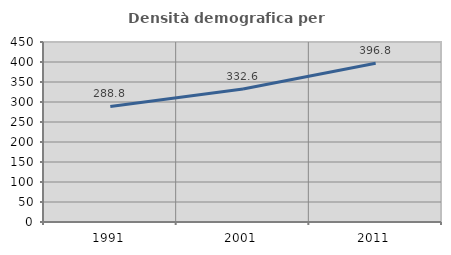
| Category | Densità demografica |
|---|---|
| 1991.0 | 288.849 |
| 2001.0 | 332.553 |
| 2011.0 | 396.75 |